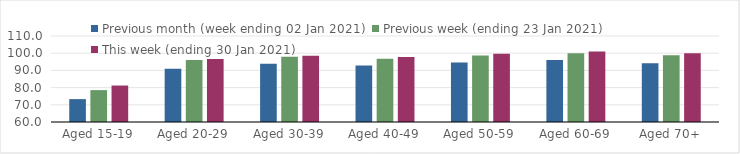
| Category | Previous month (week ending 02 Jan 2021) | Previous week (ending 23 Jan 2021) | This week (ending 30 Jan 2021) |
|---|---|---|---|
| Aged 15-19 | 73.3 | 78.54 | 81.2 |
| Aged 20-29 | 90.91 | 96.08 | 96.59 |
| Aged 30-39 | 93.81 | 97.94 | 98.46 |
| Aged 40-49 | 92.79 | 96.83 | 97.83 |
| Aged 50-59 | 94.57 | 98.69 | 99.65 |
| Aged 60-69 | 96.08 | 99.95 | 101.03 |
| Aged 70+ | 94.18 | 98.83 | 99.92 |